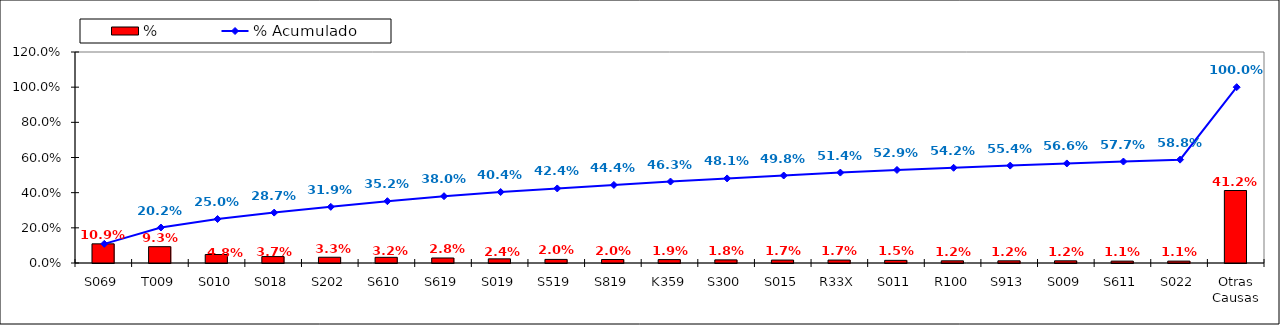
| Category | % |
|---|---|
| S069 | 0.109 |
| T009 | 0.093 |
| S010 | 0.048 |
| S018 | 0.037 |
| S202 | 0.033 |
| S610 | 0.032 |
| S619 | 0.028 |
| S019 | 0.024 |
| S519 | 0.02 |
| S819 | 0.02 |
| K359 | 0.019 |
| S300 | 0.018 |
| S015 | 0.017 |
| R33X | 0.017 |
| S011 | 0.015 |
| R100 | 0.012 |
| S913 | 0.012 |
| S009 | 0.012 |
| S611 | 0.011 |
| S022 | 0.011 |
| Otras Causas | 0.412 |